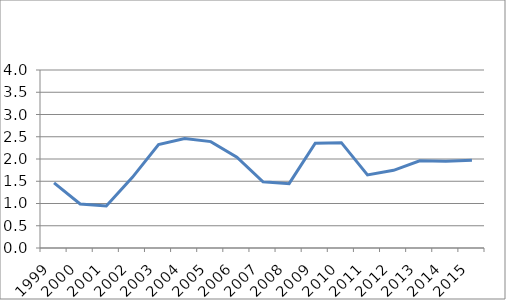
| Category | Anteil an 15- bis 64-jähriger Bevölkerung
in % |
|---|---|
| 1999.0 | 1.465 |
| 2000.0 | 0.989 |
| 2001.0 | 0.944 |
| 2002.0 | 1.588 |
| 2003.0 | 2.324 |
| 2004.0 | 2.462 |
| 2005.0 | 2.39 |
| 2006.0 | 2.042 |
| 2007.0 | 1.486 |
| 2008.0 | 1.446 |
| 2009.0 | 2.356 |
| 2010.0 | 2.367 |
| 2011.0 | 1.643 |
| 2012.0 | 1.746 |
| 2013.0 | 1.96 |
| 2014.0 | 1.949 |
| 2015.0 | 1.975 |